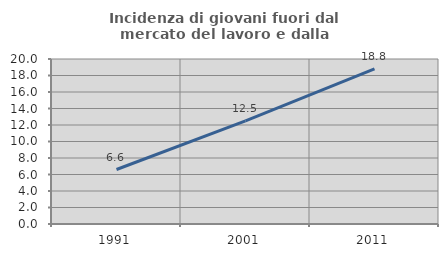
| Category | Incidenza di giovani fuori dal mercato del lavoro e dalla formazione  |
|---|---|
| 1991.0 | 6.604 |
| 2001.0 | 12.5 |
| 2011.0 | 18.803 |